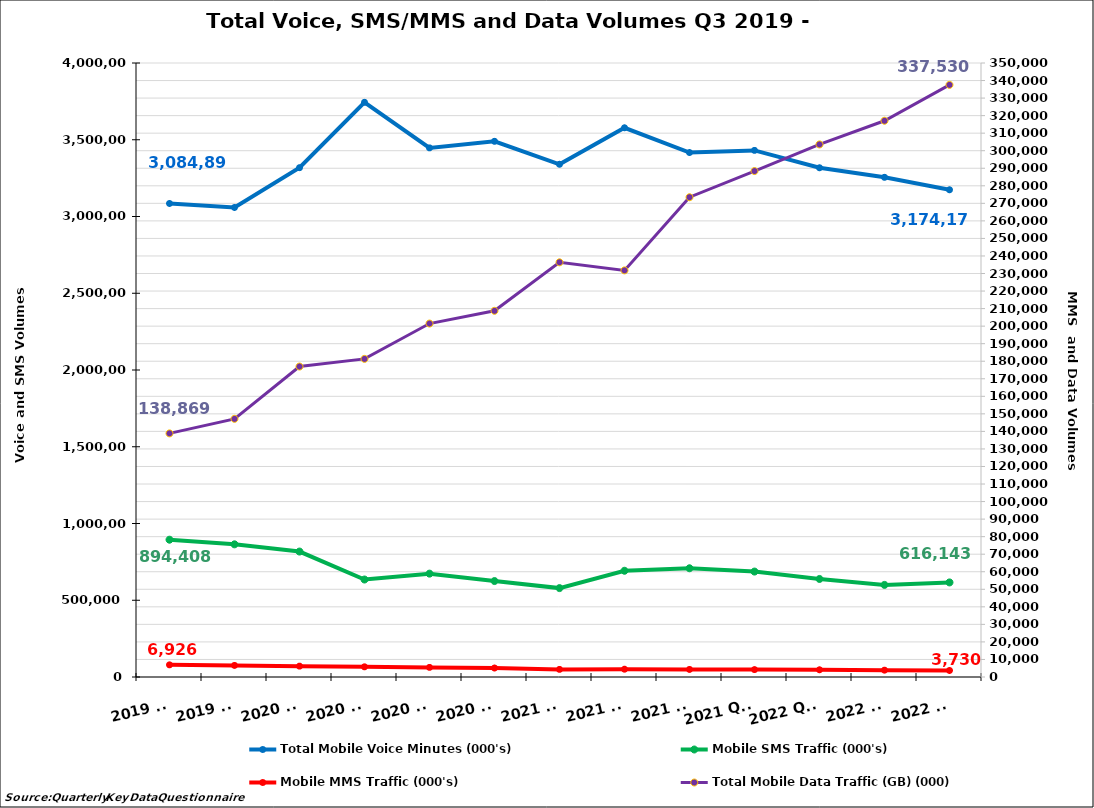
| Category | Total Mobile Voice Minutes (000's) | Mobile SMS Traffic (000's) |
|---|---|---|
| 2019 Q3 | 3084892.522 | 894408.206 |
| 2019 Q4 | 3058682.979 | 864343.063 |
| 2020 Q1 | 3317905.655 | 817190.979 |
| 2020 Q2 | 3743853.165 | 635067.581 |
| 2020 Q3 | 3447078.14 | 673286.691 |
| 2020 Q4 | 3489753.521 | 625059.091 |
| 2021 Q1 | 3340235.217 | 579171.791 |
| 2021 Q2 | 3578036.303 | 692076.001 |
| 2021 Q3 | 3416726.808 | 708452.242 |
| 2021 Q4  | 3430689.797 | 686812.513 |
| 2022 Q1  | 3317560.386 | 638652.61 |
| 2022 Q2 | 3255142.202 | 599959.818 |
| 2022 Q3 | 3174171.786 | 616142.922 |